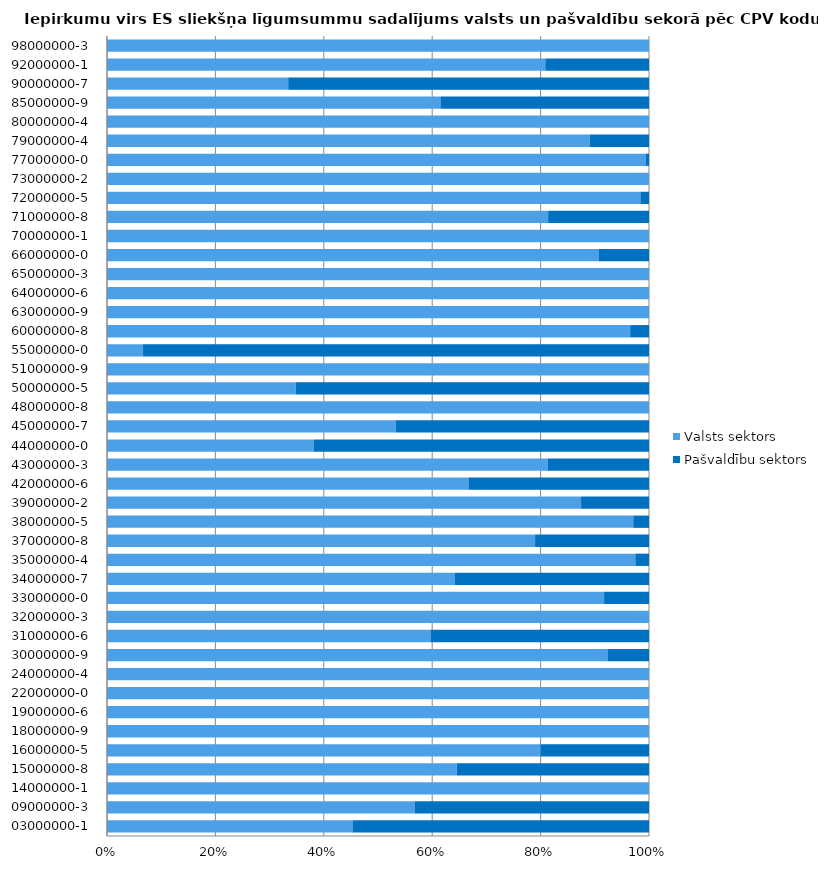
| Category | Valsts sektors | Pašvaldību sektors |
|---|---|---|
| 03000000-1 | 1289077 | 1557233 |
| 09000000-3 | 24772226 | 18880600 |
| 14000000-1 | 600713 | 0 |
| 15000000-8 | 18419819 | 10127371 |
| 16000000-5 | 1974689 | 493401 |
| 18000000-9 | 3492686 | 0 |
| 19000000-6 | 714159 | 0 |
| 22000000-0 | 2638092 | 0 |
| 24000000-4 | 6716769 | 0 |
| 30000000-9 | 49427295 | 4099443 |
| 31000000-6 | 4037859 | 2728664 |
| 32000000-3 | 2333521 | 0 |
| 33000000-0 | 268253253 | 24231396 |
| 34000000-7 | 44291949 | 24779616 |
| 35000000-4 | 6655906 | 172358 |
| 37000000-8 | 643013 | 171108 |
| 38000000-5 | 11713229 | 350000 |
| 39000000-2 | 4343325 | 622328 |
| 42000000-6 | 1401197 | 700000 |
| 43000000-3 | 1068410 | 245774 |
| 44000000-0 | 2678182 | 4346318 |
| 45000000-7 | 134487893 | 118018158 |
| 48000000-8 | 71627420 | 0 |
| 50000000-5 | 18082421 | 33803200 |
| 51000000-9 | 204856 | 0 |
| 55000000-0 | 1799369 | 25256844 |
| 60000000-8 | 91034367 | 3268654 |
| 63000000-9 | 29700690 | 0 |
| 64000000-6 | 3251208 | 0 |
| 65000000-3 | 371900 | 0 |
| 66000000-0 | 87179696 | 8949838 |
| 70000000-1 | 2250000 | 0 |
| 71000000-8 | 27692895 | 6331377 |
| 72000000-5 | 81157880 | 1307449 |
| 73000000-2 | 14363182 | 0 |
| 77000000-0 | 303971319 | 1675890 |
| 79000000-4 | 16473485 | 2024287 |
| 80000000-4 | 223000 | 0 |
| 85000000-9 | 9233276 | 5775155 |
| 90000000-7 | 12198725 | 24288650 |
| 92000000-1 | 1201668 | 284256 |
| 98000000-3 | 7460730 | 0 |